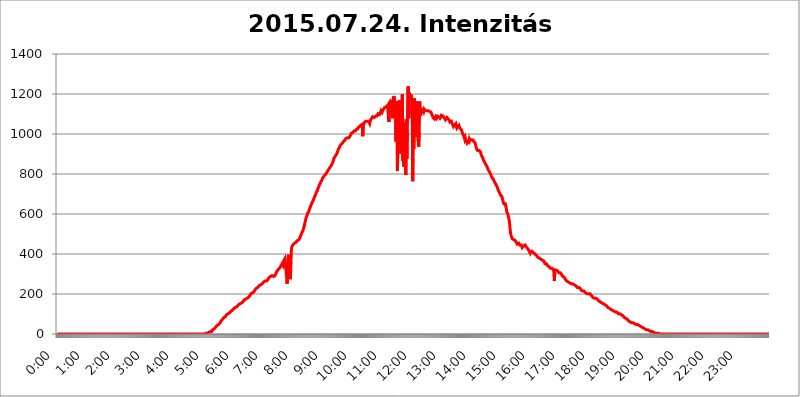
| Category | 2015.07.24. Intenzitás [W/m^2] |
|---|---|
| 0.0 | 0 |
| 0.0006944444444444445 | 0 |
| 0.001388888888888889 | 0 |
| 0.0020833333333333333 | 0 |
| 0.002777777777777778 | 0 |
| 0.003472222222222222 | 0 |
| 0.004166666666666667 | 0 |
| 0.004861111111111111 | 0 |
| 0.005555555555555556 | 0 |
| 0.0062499999999999995 | 0 |
| 0.006944444444444444 | 0 |
| 0.007638888888888889 | 0 |
| 0.008333333333333333 | 0 |
| 0.009027777777777779 | 0 |
| 0.009722222222222222 | 0 |
| 0.010416666666666666 | 0 |
| 0.011111111111111112 | 0 |
| 0.011805555555555555 | 0 |
| 0.012499999999999999 | 0 |
| 0.013194444444444444 | 0 |
| 0.013888888888888888 | 0 |
| 0.014583333333333332 | 0 |
| 0.015277777777777777 | 0 |
| 0.015972222222222224 | 0 |
| 0.016666666666666666 | 0 |
| 0.017361111111111112 | 0 |
| 0.018055555555555557 | 0 |
| 0.01875 | 0 |
| 0.019444444444444445 | 0 |
| 0.02013888888888889 | 0 |
| 0.020833333333333332 | 0 |
| 0.02152777777777778 | 0 |
| 0.022222222222222223 | 0 |
| 0.02291666666666667 | 0 |
| 0.02361111111111111 | 0 |
| 0.024305555555555556 | 0 |
| 0.024999999999999998 | 0 |
| 0.025694444444444447 | 0 |
| 0.02638888888888889 | 0 |
| 0.027083333333333334 | 0 |
| 0.027777777777777776 | 0 |
| 0.02847222222222222 | 0 |
| 0.029166666666666664 | 0 |
| 0.029861111111111113 | 0 |
| 0.030555555555555555 | 0 |
| 0.03125 | 0 |
| 0.03194444444444445 | 0 |
| 0.03263888888888889 | 0 |
| 0.03333333333333333 | 0 |
| 0.034027777777777775 | 0 |
| 0.034722222222222224 | 0 |
| 0.035416666666666666 | 0 |
| 0.036111111111111115 | 0 |
| 0.03680555555555556 | 0 |
| 0.0375 | 0 |
| 0.03819444444444444 | 0 |
| 0.03888888888888889 | 0 |
| 0.03958333333333333 | 0 |
| 0.04027777777777778 | 0 |
| 0.04097222222222222 | 0 |
| 0.041666666666666664 | 0 |
| 0.042361111111111106 | 0 |
| 0.04305555555555556 | 0 |
| 0.043750000000000004 | 0 |
| 0.044444444444444446 | 0 |
| 0.04513888888888889 | 0 |
| 0.04583333333333334 | 0 |
| 0.04652777777777778 | 0 |
| 0.04722222222222222 | 0 |
| 0.04791666666666666 | 0 |
| 0.04861111111111111 | 0 |
| 0.049305555555555554 | 0 |
| 0.049999999999999996 | 0 |
| 0.05069444444444445 | 0 |
| 0.051388888888888894 | 0 |
| 0.052083333333333336 | 0 |
| 0.05277777777777778 | 0 |
| 0.05347222222222222 | 0 |
| 0.05416666666666667 | 0 |
| 0.05486111111111111 | 0 |
| 0.05555555555555555 | 0 |
| 0.05625 | 0 |
| 0.05694444444444444 | 0 |
| 0.057638888888888885 | 0 |
| 0.05833333333333333 | 0 |
| 0.05902777777777778 | 0 |
| 0.059722222222222225 | 0 |
| 0.06041666666666667 | 0 |
| 0.061111111111111116 | 0 |
| 0.06180555555555556 | 0 |
| 0.0625 | 0 |
| 0.06319444444444444 | 0 |
| 0.06388888888888888 | 0 |
| 0.06458333333333334 | 0 |
| 0.06527777777777778 | 0 |
| 0.06597222222222222 | 0 |
| 0.06666666666666667 | 0 |
| 0.06736111111111111 | 0 |
| 0.06805555555555555 | 0 |
| 0.06874999999999999 | 0 |
| 0.06944444444444443 | 0 |
| 0.07013888888888889 | 0 |
| 0.07083333333333333 | 0 |
| 0.07152777777777779 | 0 |
| 0.07222222222222223 | 0 |
| 0.07291666666666667 | 0 |
| 0.07361111111111111 | 0 |
| 0.07430555555555556 | 0 |
| 0.075 | 0 |
| 0.07569444444444444 | 0 |
| 0.0763888888888889 | 0 |
| 0.07708333333333334 | 0 |
| 0.07777777777777778 | 0 |
| 0.07847222222222222 | 0 |
| 0.07916666666666666 | 0 |
| 0.0798611111111111 | 0 |
| 0.08055555555555556 | 0 |
| 0.08125 | 0 |
| 0.08194444444444444 | 0 |
| 0.08263888888888889 | 0 |
| 0.08333333333333333 | 0 |
| 0.08402777777777777 | 0 |
| 0.08472222222222221 | 0 |
| 0.08541666666666665 | 0 |
| 0.08611111111111112 | 0 |
| 0.08680555555555557 | 0 |
| 0.08750000000000001 | 0 |
| 0.08819444444444445 | 0 |
| 0.08888888888888889 | 0 |
| 0.08958333333333333 | 0 |
| 0.09027777777777778 | 0 |
| 0.09097222222222222 | 0 |
| 0.09166666666666667 | 0 |
| 0.09236111111111112 | 0 |
| 0.09305555555555556 | 0 |
| 0.09375 | 0 |
| 0.09444444444444444 | 0 |
| 0.09513888888888888 | 0 |
| 0.09583333333333333 | 0 |
| 0.09652777777777777 | 0 |
| 0.09722222222222222 | 0 |
| 0.09791666666666667 | 0 |
| 0.09861111111111111 | 0 |
| 0.09930555555555555 | 0 |
| 0.09999999999999999 | 0 |
| 0.10069444444444443 | 0 |
| 0.1013888888888889 | 0 |
| 0.10208333333333335 | 0 |
| 0.10277777777777779 | 0 |
| 0.10347222222222223 | 0 |
| 0.10416666666666667 | 0 |
| 0.10486111111111111 | 0 |
| 0.10555555555555556 | 0 |
| 0.10625 | 0 |
| 0.10694444444444444 | 0 |
| 0.1076388888888889 | 0 |
| 0.10833333333333334 | 0 |
| 0.10902777777777778 | 0 |
| 0.10972222222222222 | 0 |
| 0.1111111111111111 | 0 |
| 0.11180555555555556 | 0 |
| 0.11180555555555556 | 0 |
| 0.1125 | 0 |
| 0.11319444444444444 | 0 |
| 0.11388888888888889 | 0 |
| 0.11458333333333333 | 0 |
| 0.11527777777777777 | 0 |
| 0.11597222222222221 | 0 |
| 0.11666666666666665 | 0 |
| 0.1173611111111111 | 0 |
| 0.11805555555555557 | 0 |
| 0.11944444444444445 | 0 |
| 0.12013888888888889 | 0 |
| 0.12083333333333333 | 0 |
| 0.12152777777777778 | 0 |
| 0.12222222222222223 | 0 |
| 0.12291666666666667 | 0 |
| 0.12291666666666667 | 0 |
| 0.12361111111111112 | 0 |
| 0.12430555555555556 | 0 |
| 0.125 | 0 |
| 0.12569444444444444 | 0 |
| 0.12638888888888888 | 0 |
| 0.12708333333333333 | 0 |
| 0.16875 | 0 |
| 0.12847222222222224 | 0 |
| 0.12916666666666668 | 0 |
| 0.12986111111111112 | 0 |
| 0.13055555555555556 | 0 |
| 0.13125 | 0 |
| 0.13194444444444445 | 0 |
| 0.1326388888888889 | 0 |
| 0.13333333333333333 | 0 |
| 0.13402777777777777 | 0 |
| 0.13402777777777777 | 0 |
| 0.13472222222222222 | 0 |
| 0.13541666666666666 | 0 |
| 0.1361111111111111 | 0 |
| 0.13749999999999998 | 0 |
| 0.13819444444444443 | 0 |
| 0.1388888888888889 | 0 |
| 0.13958333333333334 | 0 |
| 0.14027777777777778 | 0 |
| 0.14097222222222222 | 0 |
| 0.14166666666666666 | 0 |
| 0.1423611111111111 | 0 |
| 0.14305555555555557 | 0 |
| 0.14375000000000002 | 0 |
| 0.14444444444444446 | 0 |
| 0.1451388888888889 | 0 |
| 0.1451388888888889 | 0 |
| 0.14652777777777778 | 0 |
| 0.14722222222222223 | 0 |
| 0.14791666666666667 | 0 |
| 0.1486111111111111 | 0 |
| 0.14930555555555555 | 0 |
| 0.15 | 0 |
| 0.15069444444444444 | 0 |
| 0.15138888888888888 | 0 |
| 0.15208333333333332 | 0 |
| 0.15277777777777776 | 0 |
| 0.15347222222222223 | 0 |
| 0.15416666666666667 | 0 |
| 0.15486111111111112 | 0 |
| 0.15555555555555556 | 0 |
| 0.15625 | 0 |
| 0.15694444444444444 | 0 |
| 0.15763888888888888 | 0 |
| 0.15833333333333333 | 0 |
| 0.15902777777777777 | 0 |
| 0.15972222222222224 | 0 |
| 0.16041666666666668 | 0 |
| 0.16111111111111112 | 0 |
| 0.16180555555555556 | 0 |
| 0.1625 | 0 |
| 0.16319444444444445 | 0 |
| 0.1638888888888889 | 0 |
| 0.16458333333333333 | 0 |
| 0.16527777777777777 | 0 |
| 0.16597222222222222 | 0 |
| 0.16666666666666666 | 0 |
| 0.1673611111111111 | 0 |
| 0.16805555555555554 | 0 |
| 0.16874999999999998 | 0 |
| 0.16944444444444443 | 0 |
| 0.17013888888888887 | 0 |
| 0.1708333333333333 | 0 |
| 0.17152777777777775 | 0 |
| 0.17222222222222225 | 0 |
| 0.1729166666666667 | 0 |
| 0.17361111111111113 | 0 |
| 0.17430555555555557 | 0 |
| 0.17500000000000002 | 0 |
| 0.17569444444444446 | 0 |
| 0.1763888888888889 | 0 |
| 0.17708333333333334 | 0 |
| 0.17777777777777778 | 0 |
| 0.17847222222222223 | 0 |
| 0.17916666666666667 | 0 |
| 0.1798611111111111 | 0 |
| 0.18055555555555555 | 0 |
| 0.18125 | 0 |
| 0.18194444444444444 | 0 |
| 0.1826388888888889 | 0 |
| 0.18333333333333335 | 0 |
| 0.1840277777777778 | 0 |
| 0.18472222222222223 | 0 |
| 0.18541666666666667 | 0 |
| 0.18611111111111112 | 0 |
| 0.18680555555555556 | 0 |
| 0.1875 | 0 |
| 0.18819444444444444 | 0 |
| 0.18888888888888888 | 0 |
| 0.18958333333333333 | 0 |
| 0.19027777777777777 | 0 |
| 0.1909722222222222 | 0 |
| 0.19166666666666665 | 0 |
| 0.19236111111111112 | 0 |
| 0.19305555555555554 | 0 |
| 0.19375 | 0 |
| 0.19444444444444445 | 0 |
| 0.1951388888888889 | 0 |
| 0.19583333333333333 | 0 |
| 0.19652777777777777 | 0 |
| 0.19722222222222222 | 0 |
| 0.19791666666666666 | 0 |
| 0.1986111111111111 | 0 |
| 0.19930555555555554 | 0 |
| 0.19999999999999998 | 0 |
| 0.20069444444444443 | 0 |
| 0.20138888888888887 | 0 |
| 0.2020833333333333 | 0 |
| 0.2027777777777778 | 0 |
| 0.2034722222222222 | 0 |
| 0.2041666666666667 | 0 |
| 0.20486111111111113 | 0 |
| 0.20555555555555557 | 0 |
| 0.20625000000000002 | 0 |
| 0.20694444444444446 | 3.525 |
| 0.2076388888888889 | 3.525 |
| 0.20833333333333334 | 3.525 |
| 0.20902777777777778 | 3.525 |
| 0.20972222222222223 | 3.525 |
| 0.21041666666666667 | 3.525 |
| 0.2111111111111111 | 3.525 |
| 0.21180555555555555 | 7.887 |
| 0.2125 | 7.887 |
| 0.21319444444444444 | 7.887 |
| 0.2138888888888889 | 7.887 |
| 0.21458333333333335 | 12.257 |
| 0.2152777777777778 | 12.257 |
| 0.21597222222222223 | 12.257 |
| 0.21666666666666667 | 12.257 |
| 0.21736111111111112 | 16.636 |
| 0.21805555555555556 | 21.024 |
| 0.21875 | 21.024 |
| 0.21944444444444444 | 21.024 |
| 0.22013888888888888 | 25.419 |
| 0.22083333333333333 | 29.823 |
| 0.22152777777777777 | 29.823 |
| 0.2222222222222222 | 34.234 |
| 0.22291666666666665 | 38.653 |
| 0.2236111111111111 | 38.653 |
| 0.22430555555555556 | 43.079 |
| 0.225 | 43.079 |
| 0.22569444444444445 | 47.511 |
| 0.2263888888888889 | 47.511 |
| 0.22708333333333333 | 51.951 |
| 0.22777777777777777 | 51.951 |
| 0.22847222222222222 | 56.398 |
| 0.22916666666666666 | 60.85 |
| 0.2298611111111111 | 65.31 |
| 0.23055555555555554 | 65.31 |
| 0.23124999999999998 | 69.775 |
| 0.23194444444444443 | 74.246 |
| 0.23263888888888887 | 74.246 |
| 0.2333333333333333 | 78.722 |
| 0.2340277777777778 | 83.205 |
| 0.2347222222222222 | 83.205 |
| 0.2354166666666667 | 87.692 |
| 0.23611111111111113 | 87.692 |
| 0.23680555555555557 | 92.184 |
| 0.23750000000000002 | 96.682 |
| 0.23819444444444446 | 96.682 |
| 0.2388888888888889 | 101.184 |
| 0.23958333333333334 | 101.184 |
| 0.24027777777777778 | 101.184 |
| 0.24097222222222223 | 105.69 |
| 0.24166666666666667 | 105.69 |
| 0.2423611111111111 | 110.201 |
| 0.24305555555555555 | 110.201 |
| 0.24375 | 114.716 |
| 0.24444444444444446 | 114.716 |
| 0.24513888888888888 | 119.235 |
| 0.24583333333333335 | 119.235 |
| 0.2465277777777778 | 123.758 |
| 0.24722222222222223 | 123.758 |
| 0.24791666666666667 | 128.284 |
| 0.24861111111111112 | 128.284 |
| 0.24930555555555556 | 128.284 |
| 0.25 | 132.814 |
| 0.25069444444444444 | 132.814 |
| 0.2513888888888889 | 137.347 |
| 0.2520833333333333 | 137.347 |
| 0.25277777777777777 | 137.347 |
| 0.2534722222222222 | 141.884 |
| 0.25416666666666665 | 146.423 |
| 0.2548611111111111 | 146.423 |
| 0.2555555555555556 | 146.423 |
| 0.25625000000000003 | 150.964 |
| 0.2569444444444445 | 150.964 |
| 0.2576388888888889 | 155.509 |
| 0.25833333333333336 | 155.509 |
| 0.2590277777777778 | 155.509 |
| 0.25972222222222224 | 160.056 |
| 0.2604166666666667 | 160.056 |
| 0.2611111111111111 | 164.605 |
| 0.26180555555555557 | 169.156 |
| 0.2625 | 169.156 |
| 0.26319444444444445 | 173.709 |
| 0.2638888888888889 | 173.709 |
| 0.26458333333333334 | 173.709 |
| 0.2652777777777778 | 173.709 |
| 0.2659722222222222 | 178.264 |
| 0.26666666666666666 | 178.264 |
| 0.2673611111111111 | 182.82 |
| 0.26805555555555555 | 182.82 |
| 0.26875 | 182.82 |
| 0.26944444444444443 | 187.378 |
| 0.2701388888888889 | 191.937 |
| 0.2708333333333333 | 191.937 |
| 0.27152777777777776 | 201.058 |
| 0.2722222222222222 | 201.058 |
| 0.27291666666666664 | 201.058 |
| 0.2736111111111111 | 205.62 |
| 0.2743055555555555 | 205.62 |
| 0.27499999999999997 | 210.182 |
| 0.27569444444444446 | 210.182 |
| 0.27638888888888885 | 214.746 |
| 0.27708333333333335 | 219.309 |
| 0.2777777777777778 | 219.309 |
| 0.27847222222222223 | 223.873 |
| 0.2791666666666667 | 228.436 |
| 0.2798611111111111 | 228.436 |
| 0.28055555555555556 | 233 |
| 0.28125 | 233 |
| 0.28194444444444444 | 237.564 |
| 0.2826388888888889 | 237.564 |
| 0.2833333333333333 | 242.127 |
| 0.28402777777777777 | 242.127 |
| 0.2847222222222222 | 246.689 |
| 0.28541666666666665 | 246.689 |
| 0.28611111111111115 | 251.251 |
| 0.28680555555555554 | 251.251 |
| 0.28750000000000003 | 251.251 |
| 0.2881944444444445 | 255.813 |
| 0.2888888888888889 | 255.813 |
| 0.28958333333333336 | 260.373 |
| 0.2902777777777778 | 260.373 |
| 0.29097222222222224 | 260.373 |
| 0.2916666666666667 | 264.932 |
| 0.2923611111111111 | 264.932 |
| 0.29305555555555557 | 264.932 |
| 0.29375 | 264.932 |
| 0.29444444444444445 | 269.49 |
| 0.2951388888888889 | 269.49 |
| 0.29583333333333334 | 274.047 |
| 0.2965277777777778 | 278.603 |
| 0.2972222222222222 | 283.156 |
| 0.29791666666666666 | 287.709 |
| 0.2986111111111111 | 287.709 |
| 0.29930555555555555 | 287.709 |
| 0.3 | 287.709 |
| 0.30069444444444443 | 292.259 |
| 0.3013888888888889 | 292.259 |
| 0.3020833333333333 | 292.259 |
| 0.30277777777777776 | 287.709 |
| 0.3034722222222222 | 287.709 |
| 0.30416666666666664 | 292.259 |
| 0.3048611111111111 | 292.259 |
| 0.3055555555555555 | 292.259 |
| 0.30624999999999997 | 296.808 |
| 0.3069444444444444 | 305.898 |
| 0.3076388888888889 | 305.898 |
| 0.30833333333333335 | 314.98 |
| 0.3090277777777778 | 319.517 |
| 0.30972222222222223 | 319.517 |
| 0.3104166666666667 | 324.052 |
| 0.3111111111111111 | 328.584 |
| 0.31180555555555556 | 328.584 |
| 0.3125 | 333.113 |
| 0.31319444444444444 | 333.113 |
| 0.3138888888888889 | 342.162 |
| 0.3145833333333333 | 346.682 |
| 0.31527777777777777 | 351.198 |
| 0.3159722222222222 | 346.682 |
| 0.31666666666666665 | 342.162 |
| 0.31736111111111115 | 337.639 |
| 0.31805555555555554 | 369.23 |
| 0.31875000000000003 | 373.729 |
| 0.3194444444444445 | 378.224 |
| 0.3201388888888889 | 378.224 |
| 0.32083333333333336 | 373.729 |
| 0.3215277777777778 | 292.259 |
| 0.32222222222222224 | 251.251 |
| 0.3229166666666667 | 269.49 |
| 0.3236111111111111 | 310.44 |
| 0.32430555555555557 | 396.164 |
| 0.325 | 369.23 |
| 0.32569444444444445 | 296.808 |
| 0.3263888888888889 | 274.047 |
| 0.32708333333333334 | 283.156 |
| 0.3277777777777778 | 355.712 |
| 0.3284722222222222 | 427.39 |
| 0.32916666666666666 | 436.27 |
| 0.3298611111111111 | 440.702 |
| 0.33055555555555555 | 445.129 |
| 0.33125 | 445.129 |
| 0.33194444444444443 | 449.551 |
| 0.3326388888888889 | 453.968 |
| 0.3333333333333333 | 458.38 |
| 0.3340277777777778 | 458.38 |
| 0.3347222222222222 | 458.38 |
| 0.3354166666666667 | 462.786 |
| 0.3361111111111111 | 462.786 |
| 0.3368055555555556 | 467.187 |
| 0.33749999999999997 | 471.582 |
| 0.33819444444444446 | 471.582 |
| 0.33888888888888885 | 471.582 |
| 0.33958333333333335 | 475.972 |
| 0.34027777777777773 | 480.356 |
| 0.34097222222222223 | 484.735 |
| 0.3416666666666666 | 493.475 |
| 0.3423611111111111 | 497.836 |
| 0.3430555555555555 | 506.542 |
| 0.34375 | 510.885 |
| 0.3444444444444445 | 515.223 |
| 0.3451388888888889 | 523.88 |
| 0.3458333333333334 | 528.2 |
| 0.34652777777777777 | 541.121 |
| 0.34722222222222227 | 553.986 |
| 0.34791666666666665 | 562.53 |
| 0.34861111111111115 | 575.299 |
| 0.34930555555555554 | 583.779 |
| 0.35000000000000003 | 588.009 |
| 0.3506944444444444 | 596.45 |
| 0.3513888888888889 | 604.864 |
| 0.3520833333333333 | 609.062 |
| 0.3527777777777778 | 613.252 |
| 0.3534722222222222 | 621.613 |
| 0.3541666666666667 | 625.784 |
| 0.3548611111111111 | 634.105 |
| 0.35555555555555557 | 638.256 |
| 0.35625 | 646.537 |
| 0.35694444444444445 | 650.667 |
| 0.3576388888888889 | 658.909 |
| 0.35833333333333334 | 663.019 |
| 0.3590277777777778 | 667.123 |
| 0.3597222222222222 | 675.311 |
| 0.36041666666666666 | 679.395 |
| 0.3611111111111111 | 687.544 |
| 0.36180555555555555 | 691.608 |
| 0.3625 | 699.717 |
| 0.36319444444444443 | 707.8 |
| 0.3638888888888889 | 711.832 |
| 0.3645833333333333 | 715.858 |
| 0.3652777777777778 | 723.889 |
| 0.3659722222222222 | 727.896 |
| 0.3666666666666667 | 735.89 |
| 0.3673611111111111 | 743.859 |
| 0.3680555555555556 | 747.834 |
| 0.36874999999999997 | 751.803 |
| 0.36944444444444446 | 759.723 |
| 0.37013888888888885 | 763.674 |
| 0.37083333333333335 | 767.62 |
| 0.37152777777777773 | 771.559 |
| 0.37222222222222223 | 779.42 |
| 0.3729166666666666 | 779.42 |
| 0.3736111111111111 | 787.258 |
| 0.3743055555555555 | 787.258 |
| 0.375 | 791.169 |
| 0.3756944444444445 | 795.074 |
| 0.3763888888888889 | 798.974 |
| 0.3770833333333334 | 802.868 |
| 0.37777777777777777 | 802.868 |
| 0.37847222222222227 | 810.641 |
| 0.37916666666666665 | 810.641 |
| 0.37986111111111115 | 814.519 |
| 0.38055555555555554 | 822.26 |
| 0.38125000000000003 | 826.123 |
| 0.3819444444444444 | 829.981 |
| 0.3826388888888889 | 833.834 |
| 0.3833333333333333 | 837.682 |
| 0.3840277777777778 | 841.526 |
| 0.3847222222222222 | 845.365 |
| 0.3854166666666667 | 849.199 |
| 0.3861111111111111 | 849.199 |
| 0.38680555555555557 | 860.676 |
| 0.3875 | 864.493 |
| 0.38819444444444445 | 879.719 |
| 0.3888888888888889 | 879.719 |
| 0.38958333333333334 | 887.309 |
| 0.3902777777777778 | 891.099 |
| 0.3909722222222222 | 894.885 |
| 0.39166666666666666 | 894.885 |
| 0.3923611111111111 | 902.447 |
| 0.39305555555555555 | 909.996 |
| 0.39375 | 917.534 |
| 0.39444444444444443 | 925.06 |
| 0.3951388888888889 | 928.819 |
| 0.3958333333333333 | 932.576 |
| 0.3965277777777778 | 940.082 |
| 0.3972222222222222 | 943.832 |
| 0.3979166666666667 | 947.58 |
| 0.3986111111111111 | 947.58 |
| 0.3993055555555556 | 951.327 |
| 0.39999999999999997 | 955.071 |
| 0.40069444444444446 | 955.071 |
| 0.40138888888888885 | 962.555 |
| 0.40208333333333335 | 962.555 |
| 0.40277777777777773 | 966.295 |
| 0.40347222222222223 | 970.034 |
| 0.4041666666666666 | 973.772 |
| 0.4048611111111111 | 977.508 |
| 0.4055555555555555 | 977.508 |
| 0.40625 | 981.244 |
| 0.4069444444444445 | 981.244 |
| 0.4076388888888889 | 981.244 |
| 0.4083333333333334 | 981.244 |
| 0.40902777777777777 | 981.244 |
| 0.40972222222222227 | 984.98 |
| 0.41041666666666665 | 984.98 |
| 0.41111111111111115 | 992.448 |
| 0.41180555555555554 | 996.182 |
| 0.41250000000000003 | 1003.65 |
| 0.4131944444444444 | 1007.383 |
| 0.4138888888888889 | 1007.383 |
| 0.4145833333333333 | 1007.383 |
| 0.4152777777777778 | 1011.118 |
| 0.4159722222222222 | 1014.852 |
| 0.4166666666666667 | 1014.852 |
| 0.4173611111111111 | 1014.852 |
| 0.41805555555555557 | 1014.852 |
| 0.41875 | 1018.587 |
| 0.41944444444444445 | 1022.323 |
| 0.4201388888888889 | 1026.06 |
| 0.42083333333333334 | 1022.323 |
| 0.4215277777777778 | 1026.06 |
| 0.4222222222222222 | 1033.537 |
| 0.42291666666666666 | 1029.798 |
| 0.4236111111111111 | 1033.537 |
| 0.42430555555555555 | 1037.277 |
| 0.425 | 1041.019 |
| 0.42569444444444443 | 1044.762 |
| 0.4263888888888889 | 1044.762 |
| 0.4270833333333333 | 1044.762 |
| 0.4277777777777778 | 1048.508 |
| 0.4284722222222222 | 988.714 |
| 0.4291666666666667 | 1037.277 |
| 0.4298611111111111 | 1048.508 |
| 0.4305555555555556 | 1056.004 |
| 0.43124999999999997 | 1059.756 |
| 0.43194444444444446 | 1059.756 |
| 0.43263888888888885 | 1063.51 |
| 0.43333333333333335 | 1059.756 |
| 0.43402777777777773 | 1063.51 |
| 0.43472222222222223 | 1063.51 |
| 0.4354166666666666 | 1063.51 |
| 0.4361111111111111 | 1067.267 |
| 0.4368055555555555 | 1063.51 |
| 0.4375 | 1063.51 |
| 0.4381944444444445 | 1052.255 |
| 0.4388888888888889 | 1063.51 |
| 0.4395833333333334 | 1071.027 |
| 0.44027777777777777 | 1071.027 |
| 0.44097222222222227 | 1078.555 |
| 0.44166666666666665 | 1082.324 |
| 0.44236111111111115 | 1086.097 |
| 0.44305555555555554 | 1086.097 |
| 0.44375000000000003 | 1082.324 |
| 0.4444444444444444 | 1082.324 |
| 0.4451388888888889 | 1086.097 |
| 0.4458333333333333 | 1086.097 |
| 0.4465277777777778 | 1089.873 |
| 0.4472222222222222 | 1089.873 |
| 0.4479166666666667 | 1089.873 |
| 0.4486111111111111 | 1089.873 |
| 0.44930555555555557 | 1093.653 |
| 0.45 | 1101.226 |
| 0.45069444444444445 | 1101.226 |
| 0.4513888888888889 | 1101.226 |
| 0.45208333333333334 | 1097.437 |
| 0.4527777777777778 | 1101.226 |
| 0.4534722222222222 | 1108.816 |
| 0.45416666666666666 | 1116.426 |
| 0.4548611111111111 | 1116.426 |
| 0.45555555555555555 | 1108.816 |
| 0.45625 | 1116.426 |
| 0.45694444444444443 | 1120.238 |
| 0.4576388888888889 | 1124.056 |
| 0.4583333333333333 | 1127.879 |
| 0.4590277777777778 | 1131.708 |
| 0.4597222222222222 | 1127.879 |
| 0.4604166666666667 | 1131.708 |
| 0.4611111111111111 | 1135.543 |
| 0.4618055555555556 | 1135.543 |
| 0.46249999999999997 | 1139.384 |
| 0.46319444444444446 | 1143.232 |
| 0.46388888888888885 | 1143.232 |
| 0.46458333333333335 | 1147.086 |
| 0.46527777777777773 | 1059.756 |
| 0.46597222222222223 | 1162.571 |
| 0.4666666666666666 | 1154.814 |
| 0.4673611111111111 | 1162.571 |
| 0.4680555555555555 | 1162.571 |
| 0.46875 | 1158.689 |
| 0.4694444444444445 | 1150.946 |
| 0.4701388888888889 | 1078.555 |
| 0.4708333333333334 | 1170.358 |
| 0.47152777777777777 | 1178.177 |
| 0.47222222222222227 | 1189.969 |
| 0.47291666666666665 | 1193.918 |
| 0.47361111111111115 | 1193.918 |
| 0.47430555555555554 | 1108.816 |
| 0.47500000000000003 | 962.555 |
| 0.4756944444444444 | 1162.571 |
| 0.4763888888888889 | 1078.555 |
| 0.4770833333333333 | 814.519 |
| 0.4777777777777778 | 981.244 |
| 0.4784722222222222 | 966.295 |
| 0.4791666666666667 | 992.448 |
| 0.4798611111111111 | 1170.358 |
| 0.48055555555555557 | 940.082 |
| 0.48125 | 1041.019 |
| 0.48194444444444445 | 902.447 |
| 0.4826388888888889 | 1022.323 |
| 0.48333333333333334 | 977.508 |
| 0.4840277777777778 | 1197.876 |
| 0.4847222222222222 | 864.493 |
| 0.48541666666666666 | 962.555 |
| 0.4861111111111111 | 837.682 |
| 0.48680555555555555 | 1059.756 |
| 0.4875 | 947.58 |
| 0.48819444444444443 | 887.309 |
| 0.4888888888888889 | 795.074 |
| 0.4895833333333333 | 1074.789 |
| 0.4902777777777778 | 875.918 |
| 0.4909722222222222 | 1014.852 |
| 0.4916666666666667 | 1229.899 |
| 0.4923611111111111 | 1238.014 |
| 0.4930555555555556 | 1078.555 |
| 0.49374999999999997 | 1205.82 |
| 0.49444444444444446 | 1209.807 |
| 0.49513888888888885 | 1186.03 |
| 0.49583333333333335 | 1197.876 |
| 0.49652777777777773 | 1189.969 |
| 0.49722222222222223 | 1178.177 |
| 0.4979166666666666 | 1078.555 |
| 0.4986111111111111 | 763.674 |
| 0.4993055555555555 | 1174.263 |
| 0.5 | 925.06 |
| 0.5006944444444444 | 1178.177 |
| 0.5013888888888889 | 1174.263 |
| 0.5020833333333333 | 1093.653 |
| 0.5027777777777778 | 984.98 |
| 0.5034722222222222 | 1086.097 |
| 0.5041666666666667 | 1154.814 |
| 0.5048611111111111 | 1162.571 |
| 0.5055555555555555 | 1158.689 |
| 0.50625 | 966.295 |
| 0.5069444444444444 | 936.33 |
| 0.5076388888888889 | 1011.118 |
| 0.5083333333333333 | 1162.571 |
| 0.5090277777777777 | 1101.226 |
| 0.5097222222222222 | 1089.873 |
| 0.5104166666666666 | 1124.056 |
| 0.5111111111111112 | 1124.056 |
| 0.5118055555555555 | 1127.879 |
| 0.5125000000000001 | 1124.056 |
| 0.5131944444444444 | 1120.238 |
| 0.513888888888889 | 1112.618 |
| 0.5145833333333333 | 1124.056 |
| 0.5152777777777778 | 1124.056 |
| 0.5159722222222222 | 1116.426 |
| 0.5166666666666667 | 1116.426 |
| 0.517361111111111 | 1116.426 |
| 0.5180555555555556 | 1116.426 |
| 0.5187499999999999 | 1116.426 |
| 0.5194444444444445 | 1116.426 |
| 0.5201388888888888 | 1116.426 |
| 0.5208333333333334 | 1112.618 |
| 0.5215277777777778 | 1112.618 |
| 0.5222222222222223 | 1112.618 |
| 0.5229166666666667 | 1112.618 |
| 0.5236111111111111 | 1108.816 |
| 0.5243055555555556 | 1108.816 |
| 0.525 | 1101.226 |
| 0.5256944444444445 | 1097.437 |
| 0.5263888888888889 | 1097.437 |
| 0.5270833333333333 | 1082.324 |
| 0.5277777777777778 | 1078.555 |
| 0.5284722222222222 | 1086.097 |
| 0.5291666666666667 | 1074.789 |
| 0.5298611111111111 | 1078.555 |
| 0.5305555555555556 | 1086.097 |
| 0.53125 | 1082.324 |
| 0.5319444444444444 | 1078.555 |
| 0.5326388888888889 | 1082.324 |
| 0.5333333333333333 | 1089.873 |
| 0.5340277777777778 | 1089.873 |
| 0.5347222222222222 | 1089.873 |
| 0.5354166666666667 | 1086.097 |
| 0.5361111111111111 | 1082.324 |
| 0.5368055555555555 | 1078.555 |
| 0.5375 | 1082.324 |
| 0.5381944444444444 | 1086.097 |
| 0.5388888888888889 | 1093.653 |
| 0.5395833333333333 | 1093.653 |
| 0.5402777777777777 | 1093.653 |
| 0.5409722222222222 | 1089.873 |
| 0.5416666666666666 | 1089.873 |
| 0.5423611111111112 | 1086.097 |
| 0.5430555555555555 | 1078.555 |
| 0.5437500000000001 | 1082.324 |
| 0.5444444444444444 | 1071.027 |
| 0.545138888888889 | 1067.267 |
| 0.5458333333333333 | 1071.027 |
| 0.5465277777777778 | 1082.324 |
| 0.5472222222222222 | 1082.324 |
| 0.5479166666666667 | 1078.555 |
| 0.548611111111111 | 1074.789 |
| 0.5493055555555556 | 1071.027 |
| 0.5499999999999999 | 1067.267 |
| 0.5506944444444445 | 1059.756 |
| 0.5513888888888888 | 1063.51 |
| 0.5520833333333334 | 1059.756 |
| 0.5527777777777778 | 1063.51 |
| 0.5534722222222223 | 1056.004 |
| 0.5541666666666667 | 1059.756 |
| 0.5548611111111111 | 1052.255 |
| 0.5555555555555556 | 1037.277 |
| 0.55625 | 1037.277 |
| 0.5569444444444445 | 1044.762 |
| 0.5576388888888889 | 1048.508 |
| 0.5583333333333333 | 1041.019 |
| 0.5590277777777778 | 1052.255 |
| 0.5597222222222222 | 1037.277 |
| 0.5604166666666667 | 1029.798 |
| 0.5611111111111111 | 1033.537 |
| 0.5618055555555556 | 1037.277 |
| 0.5625 | 1048.508 |
| 0.5631944444444444 | 1029.798 |
| 0.5638888888888889 | 1037.277 |
| 0.5645833333333333 | 1029.798 |
| 0.5652777777777778 | 1029.798 |
| 0.5659722222222222 | 1026.06 |
| 0.5666666666666667 | 1022.323 |
| 0.5673611111111111 | 1018.587 |
| 0.5680555555555555 | 1007.383 |
| 0.56875 | 999.916 |
| 0.5694444444444444 | 999.916 |
| 0.5701388888888889 | 996.182 |
| 0.5708333333333333 | 984.98 |
| 0.5715277777777777 | 973.772 |
| 0.5722222222222222 | 981.244 |
| 0.5729166666666666 | 970.034 |
| 0.5736111111111112 | 958.814 |
| 0.5743055555555555 | 970.034 |
| 0.5750000000000001 | 955.071 |
| 0.5756944444444444 | 951.327 |
| 0.576388888888889 | 955.071 |
| 0.5770833333333333 | 962.555 |
| 0.5777777777777778 | 973.772 |
| 0.5784722222222222 | 966.295 |
| 0.5791666666666667 | 973.772 |
| 0.579861111111111 | 977.508 |
| 0.5805555555555556 | 970.034 |
| 0.5812499999999999 | 970.034 |
| 0.5819444444444445 | 973.772 |
| 0.5826388888888888 | 973.772 |
| 0.5833333333333334 | 970.034 |
| 0.5840277777777778 | 962.555 |
| 0.5847222222222223 | 958.814 |
| 0.5854166666666667 | 958.814 |
| 0.5861111111111111 | 955.071 |
| 0.5868055555555556 | 951.327 |
| 0.5875 | 936.33 |
| 0.5881944444444445 | 925.06 |
| 0.5888888888888889 | 925.06 |
| 0.5895833333333333 | 917.534 |
| 0.5902777777777778 | 921.298 |
| 0.5909722222222222 | 917.534 |
| 0.5916666666666667 | 917.534 |
| 0.5923611111111111 | 917.534 |
| 0.5930555555555556 | 917.534 |
| 0.59375 | 909.996 |
| 0.5944444444444444 | 898.668 |
| 0.5951388888888889 | 891.099 |
| 0.5958333333333333 | 887.309 |
| 0.5965277777777778 | 883.516 |
| 0.5972222222222222 | 875.918 |
| 0.5979166666666667 | 868.305 |
| 0.5986111111111111 | 864.493 |
| 0.5993055555555555 | 860.676 |
| 0.6 | 853.029 |
| 0.6006944444444444 | 849.199 |
| 0.6013888888888889 | 849.199 |
| 0.6020833333333333 | 841.526 |
| 0.6027777777777777 | 837.682 |
| 0.6034722222222222 | 829.981 |
| 0.6041666666666666 | 822.26 |
| 0.6048611111111112 | 818.392 |
| 0.6055555555555555 | 818.392 |
| 0.6062500000000001 | 810.641 |
| 0.6069444444444444 | 810.641 |
| 0.607638888888889 | 810.641 |
| 0.6083333333333333 | 795.074 |
| 0.6090277777777778 | 787.258 |
| 0.6097222222222222 | 783.342 |
| 0.6104166666666667 | 783.342 |
| 0.611111111111111 | 775.492 |
| 0.6118055555555556 | 771.559 |
| 0.6124999999999999 | 767.62 |
| 0.6131944444444445 | 763.674 |
| 0.6138888888888888 | 755.766 |
| 0.6145833333333334 | 751.803 |
| 0.6152777777777778 | 747.834 |
| 0.6159722222222223 | 747.834 |
| 0.6166666666666667 | 743.859 |
| 0.6173611111111111 | 731.896 |
| 0.6180555555555556 | 723.889 |
| 0.61875 | 719.877 |
| 0.6194444444444445 | 711.832 |
| 0.6201388888888889 | 715.858 |
| 0.6208333333333333 | 703.762 |
| 0.6215277777777778 | 695.666 |
| 0.6222222222222222 | 691.608 |
| 0.6229166666666667 | 695.666 |
| 0.6236111111111111 | 687.544 |
| 0.6243055555555556 | 683.473 |
| 0.625 | 667.123 |
| 0.6256944444444444 | 663.019 |
| 0.6263888888888889 | 650.667 |
| 0.6270833333333333 | 654.791 |
| 0.6277777777777778 | 654.791 |
| 0.6284722222222222 | 650.667 |
| 0.6291666666666667 | 638.256 |
| 0.6298611111111111 | 625.784 |
| 0.6305555555555555 | 609.062 |
| 0.63125 | 604.864 |
| 0.6319444444444444 | 600.661 |
| 0.6326388888888889 | 588.009 |
| 0.6333333333333333 | 583.779 |
| 0.6340277777777777 | 566.793 |
| 0.6347222222222222 | 541.121 |
| 0.6354166666666666 | 515.223 |
| 0.6361111111111112 | 497.836 |
| 0.6368055555555555 | 489.108 |
| 0.6375000000000001 | 484.735 |
| 0.6381944444444444 | 475.972 |
| 0.638888888888889 | 471.582 |
| 0.6395833333333333 | 471.582 |
| 0.6402777777777778 | 471.582 |
| 0.6409722222222222 | 471.582 |
| 0.6416666666666667 | 471.582 |
| 0.642361111111111 | 467.187 |
| 0.6430555555555556 | 462.786 |
| 0.6437499999999999 | 458.38 |
| 0.6444444444444445 | 453.968 |
| 0.6451388888888888 | 449.551 |
| 0.6458333333333334 | 449.551 |
| 0.6465277777777778 | 453.968 |
| 0.6472222222222223 | 453.968 |
| 0.6479166666666667 | 453.968 |
| 0.6486111111111111 | 445.129 |
| 0.6493055555555556 | 449.551 |
| 0.65 | 445.129 |
| 0.6506944444444445 | 445.129 |
| 0.6513888888888889 | 440.702 |
| 0.6520833333333333 | 431.833 |
| 0.6527777777777778 | 427.39 |
| 0.6534722222222222 | 436.27 |
| 0.6541666666666667 | 440.702 |
| 0.6548611111111111 | 440.702 |
| 0.6555555555555556 | 440.702 |
| 0.65625 | 445.129 |
| 0.6569444444444444 | 440.702 |
| 0.6576388888888889 | 436.27 |
| 0.6583333333333333 | 431.833 |
| 0.6590277777777778 | 431.833 |
| 0.6597222222222222 | 427.39 |
| 0.6604166666666667 | 427.39 |
| 0.6611111111111111 | 418.492 |
| 0.6618055555555555 | 418.492 |
| 0.6625 | 422.943 |
| 0.6631944444444444 | 405.108 |
| 0.6638888888888889 | 414.035 |
| 0.6645833333333333 | 414.035 |
| 0.6652777777777777 | 414.035 |
| 0.6659722222222222 | 414.035 |
| 0.6666666666666666 | 414.035 |
| 0.6673611111111111 | 414.035 |
| 0.6680555555555556 | 405.108 |
| 0.6687500000000001 | 405.108 |
| 0.6694444444444444 | 400.638 |
| 0.6701388888888888 | 400.638 |
| 0.6708333333333334 | 396.164 |
| 0.6715277777777778 | 396.164 |
| 0.6722222222222222 | 391.685 |
| 0.6729166666666666 | 387.202 |
| 0.6736111111111112 | 387.202 |
| 0.6743055555555556 | 382.715 |
| 0.6749999999999999 | 382.715 |
| 0.6756944444444444 | 378.224 |
| 0.6763888888888889 | 378.224 |
| 0.6770833333333334 | 378.224 |
| 0.6777777777777777 | 378.224 |
| 0.6784722222222223 | 373.729 |
| 0.6791666666666667 | 373.729 |
| 0.6798611111111111 | 369.23 |
| 0.6805555555555555 | 369.23 |
| 0.68125 | 369.23 |
| 0.6819444444444445 | 364.728 |
| 0.6826388888888889 | 364.728 |
| 0.6833333333333332 | 360.221 |
| 0.6840277777777778 | 351.198 |
| 0.6847222222222222 | 351.198 |
| 0.6854166666666667 | 351.198 |
| 0.686111111111111 | 351.198 |
| 0.6868055555555556 | 346.682 |
| 0.6875 | 342.162 |
| 0.6881944444444444 | 337.639 |
| 0.688888888888889 | 337.639 |
| 0.6895833333333333 | 337.639 |
| 0.6902777777777778 | 333.113 |
| 0.6909722222222222 | 333.113 |
| 0.6916666666666668 | 328.584 |
| 0.6923611111111111 | 328.584 |
| 0.6930555555555555 | 328.584 |
| 0.69375 | 328.584 |
| 0.6944444444444445 | 328.584 |
| 0.6951388888888889 | 328.584 |
| 0.6958333333333333 | 324.052 |
| 0.6965277777777777 | 310.44 |
| 0.6972222222222223 | 264.932 |
| 0.6979166666666666 | 319.517 |
| 0.6986111111111111 | 319.517 |
| 0.6993055555555556 | 314.98 |
| 0.7000000000000001 | 319.517 |
| 0.7006944444444444 | 314.98 |
| 0.7013888888888888 | 314.98 |
| 0.7020833333333334 | 314.98 |
| 0.7027777777777778 | 310.44 |
| 0.7034722222222222 | 305.898 |
| 0.7041666666666666 | 305.898 |
| 0.7048611111111112 | 305.898 |
| 0.7055555555555556 | 305.898 |
| 0.7062499999999999 | 305.898 |
| 0.7069444444444444 | 301.354 |
| 0.7076388888888889 | 296.808 |
| 0.7083333333333334 | 296.808 |
| 0.7090277777777777 | 287.709 |
| 0.7097222222222223 | 287.709 |
| 0.7104166666666667 | 287.709 |
| 0.7111111111111111 | 283.156 |
| 0.7118055555555555 | 278.603 |
| 0.7125 | 274.047 |
| 0.7131944444444445 | 274.047 |
| 0.7138888888888889 | 269.49 |
| 0.7145833333333332 | 264.932 |
| 0.7152777777777778 | 260.373 |
| 0.7159722222222222 | 260.373 |
| 0.7166666666666667 | 260.373 |
| 0.717361111111111 | 260.373 |
| 0.7180555555555556 | 260.373 |
| 0.71875 | 255.813 |
| 0.7194444444444444 | 255.813 |
| 0.720138888888889 | 255.813 |
| 0.7208333333333333 | 251.251 |
| 0.7215277777777778 | 251.251 |
| 0.7222222222222222 | 251.251 |
| 0.7229166666666668 | 251.251 |
| 0.7236111111111111 | 251.251 |
| 0.7243055555555555 | 246.689 |
| 0.725 | 246.689 |
| 0.7256944444444445 | 246.689 |
| 0.7263888888888889 | 242.127 |
| 0.7270833333333333 | 242.127 |
| 0.7277777777777777 | 242.127 |
| 0.7284722222222223 | 237.564 |
| 0.7291666666666666 | 233 |
| 0.7298611111111111 | 233 |
| 0.7305555555555556 | 233 |
| 0.7312500000000001 | 233 |
| 0.7319444444444444 | 228.436 |
| 0.7326388888888888 | 228.436 |
| 0.7333333333333334 | 228.436 |
| 0.7340277777777778 | 223.873 |
| 0.7347222222222222 | 219.309 |
| 0.7354166666666666 | 219.309 |
| 0.7361111111111112 | 219.309 |
| 0.7368055555555556 | 214.746 |
| 0.7374999999999999 | 214.746 |
| 0.7381944444444444 | 214.746 |
| 0.7388888888888889 | 214.746 |
| 0.7395833333333334 | 210.182 |
| 0.7402777777777777 | 210.182 |
| 0.7409722222222223 | 205.62 |
| 0.7416666666666667 | 205.62 |
| 0.7423611111111111 | 205.62 |
| 0.7430555555555555 | 201.058 |
| 0.74375 | 201.058 |
| 0.7444444444444445 | 201.058 |
| 0.7451388888888889 | 201.058 |
| 0.7458333333333332 | 201.058 |
| 0.7465277777777778 | 201.058 |
| 0.7472222222222222 | 201.058 |
| 0.7479166666666667 | 196.497 |
| 0.748611111111111 | 196.497 |
| 0.7493055555555556 | 191.937 |
| 0.75 | 191.937 |
| 0.7506944444444444 | 187.378 |
| 0.751388888888889 | 182.82 |
| 0.7520833333333333 | 182.82 |
| 0.7527777777777778 | 182.82 |
| 0.7534722222222222 | 178.264 |
| 0.7541666666666668 | 178.264 |
| 0.7548611111111111 | 178.264 |
| 0.7555555555555555 | 178.264 |
| 0.75625 | 173.709 |
| 0.7569444444444445 | 173.709 |
| 0.7576388888888889 | 173.709 |
| 0.7583333333333333 | 169.156 |
| 0.7590277777777777 | 169.156 |
| 0.7597222222222223 | 164.605 |
| 0.7604166666666666 | 164.605 |
| 0.7611111111111111 | 164.605 |
| 0.7618055555555556 | 160.056 |
| 0.7625000000000001 | 160.056 |
| 0.7631944444444444 | 155.509 |
| 0.7638888888888888 | 155.509 |
| 0.7645833333333334 | 155.509 |
| 0.7652777777777778 | 155.509 |
| 0.7659722222222222 | 150.964 |
| 0.7666666666666666 | 150.964 |
| 0.7673611111111112 | 146.423 |
| 0.7680555555555556 | 146.423 |
| 0.7687499999999999 | 146.423 |
| 0.7694444444444444 | 141.884 |
| 0.7701388888888889 | 141.884 |
| 0.7708333333333334 | 137.347 |
| 0.7715277777777777 | 137.347 |
| 0.7722222222222223 | 132.814 |
| 0.7729166666666667 | 132.814 |
| 0.7736111111111111 | 128.284 |
| 0.7743055555555555 | 128.284 |
| 0.775 | 128.284 |
| 0.7756944444444445 | 128.284 |
| 0.7763888888888889 | 123.758 |
| 0.7770833333333332 | 123.758 |
| 0.7777777777777778 | 123.758 |
| 0.7784722222222222 | 119.235 |
| 0.7791666666666667 | 119.235 |
| 0.779861111111111 | 119.235 |
| 0.7805555555555556 | 114.716 |
| 0.78125 | 114.716 |
| 0.7819444444444444 | 114.716 |
| 0.782638888888889 | 110.201 |
| 0.7833333333333333 | 110.201 |
| 0.7840277777777778 | 110.201 |
| 0.7847222222222222 | 110.201 |
| 0.7854166666666668 | 105.69 |
| 0.7861111111111111 | 105.69 |
| 0.7868055555555555 | 101.184 |
| 0.7875 | 101.184 |
| 0.7881944444444445 | 101.184 |
| 0.7888888888888889 | 101.184 |
| 0.7895833333333333 | 101.184 |
| 0.7902777777777777 | 96.682 |
| 0.7909722222222223 | 96.682 |
| 0.7916666666666666 | 92.184 |
| 0.7923611111111111 | 92.184 |
| 0.7930555555555556 | 92.184 |
| 0.7937500000000001 | 87.692 |
| 0.7944444444444444 | 87.692 |
| 0.7951388888888888 | 83.205 |
| 0.7958333333333334 | 83.205 |
| 0.7965277777777778 | 78.722 |
| 0.7972222222222222 | 78.722 |
| 0.7979166666666666 | 74.246 |
| 0.7986111111111112 | 74.246 |
| 0.7993055555555556 | 74.246 |
| 0.7999999999999999 | 69.775 |
| 0.8006944444444444 | 69.775 |
| 0.8013888888888889 | 65.31 |
| 0.8020833333333334 | 65.31 |
| 0.8027777777777777 | 65.31 |
| 0.8034722222222223 | 60.85 |
| 0.8041666666666667 | 60.85 |
| 0.8048611111111111 | 60.85 |
| 0.8055555555555555 | 56.398 |
| 0.80625 | 56.398 |
| 0.8069444444444445 | 56.398 |
| 0.8076388888888889 | 56.398 |
| 0.8083333333333332 | 51.951 |
| 0.8090277777777778 | 51.951 |
| 0.8097222222222222 | 51.951 |
| 0.8104166666666667 | 51.951 |
| 0.811111111111111 | 51.951 |
| 0.8118055555555556 | 47.511 |
| 0.8125 | 47.511 |
| 0.8131944444444444 | 47.511 |
| 0.813888888888889 | 47.511 |
| 0.8145833333333333 | 47.511 |
| 0.8152777777777778 | 47.511 |
| 0.8159722222222222 | 43.079 |
| 0.8166666666666668 | 43.079 |
| 0.8173611111111111 | 43.079 |
| 0.8180555555555555 | 38.653 |
| 0.81875 | 38.653 |
| 0.8194444444444445 | 38.653 |
| 0.8201388888888889 | 34.234 |
| 0.8208333333333333 | 34.234 |
| 0.8215277777777777 | 29.823 |
| 0.8222222222222223 | 29.823 |
| 0.8229166666666666 | 29.823 |
| 0.8236111111111111 | 29.823 |
| 0.8243055555555556 | 25.419 |
| 0.8250000000000001 | 25.419 |
| 0.8256944444444444 | 21.024 |
| 0.8263888888888888 | 21.024 |
| 0.8270833333333334 | 21.024 |
| 0.8277777777777778 | 21.024 |
| 0.8284722222222222 | 21.024 |
| 0.8291666666666666 | 21.024 |
| 0.8298611111111112 | 16.636 |
| 0.8305555555555556 | 16.636 |
| 0.8312499999999999 | 16.636 |
| 0.8319444444444444 | 16.636 |
| 0.8326388888888889 | 12.257 |
| 0.8333333333333334 | 12.257 |
| 0.8340277777777777 | 12.257 |
| 0.8347222222222223 | 12.257 |
| 0.8354166666666667 | 7.887 |
| 0.8361111111111111 | 7.887 |
| 0.8368055555555555 | 7.887 |
| 0.8375 | 7.887 |
| 0.8381944444444445 | 3.525 |
| 0.8388888888888889 | 3.525 |
| 0.8395833333333332 | 3.525 |
| 0.8402777777777778 | 3.525 |
| 0.8409722222222222 | 3.525 |
| 0.8416666666666667 | 3.525 |
| 0.842361111111111 | 3.525 |
| 0.8430555555555556 | 3.525 |
| 0.84375 | 3.525 |
| 0.8444444444444444 | 0 |
| 0.845138888888889 | 0 |
| 0.8458333333333333 | 0 |
| 0.8465277777777778 | 0 |
| 0.8472222222222222 | 0 |
| 0.8479166666666668 | 0 |
| 0.8486111111111111 | 0 |
| 0.8493055555555555 | 0 |
| 0.85 | 0 |
| 0.8506944444444445 | 0 |
| 0.8513888888888889 | 0 |
| 0.8520833333333333 | 0 |
| 0.8527777777777777 | 0 |
| 0.8534722222222223 | 0 |
| 0.8541666666666666 | 0 |
| 0.8548611111111111 | 0 |
| 0.8555555555555556 | 0 |
| 0.8562500000000001 | 0 |
| 0.8569444444444444 | 0 |
| 0.8576388888888888 | 0 |
| 0.8583333333333334 | 0 |
| 0.8590277777777778 | 0 |
| 0.8597222222222222 | 0 |
| 0.8604166666666666 | 0 |
| 0.8611111111111112 | 0 |
| 0.8618055555555556 | 0 |
| 0.8624999999999999 | 0 |
| 0.8631944444444444 | 0 |
| 0.8638888888888889 | 0 |
| 0.8645833333333334 | 0 |
| 0.8652777777777777 | 0 |
| 0.8659722222222223 | 0 |
| 0.8666666666666667 | 0 |
| 0.8673611111111111 | 0 |
| 0.8680555555555555 | 0 |
| 0.86875 | 0 |
| 0.8694444444444445 | 0 |
| 0.8701388888888889 | 0 |
| 0.8708333333333332 | 0 |
| 0.8715277777777778 | 0 |
| 0.8722222222222222 | 0 |
| 0.8729166666666667 | 0 |
| 0.873611111111111 | 0 |
| 0.8743055555555556 | 0 |
| 0.875 | 0 |
| 0.8756944444444444 | 0 |
| 0.876388888888889 | 0 |
| 0.8770833333333333 | 0 |
| 0.8777777777777778 | 0 |
| 0.8784722222222222 | 0 |
| 0.8791666666666668 | 0 |
| 0.8798611111111111 | 0 |
| 0.8805555555555555 | 0 |
| 0.88125 | 0 |
| 0.8819444444444445 | 0 |
| 0.8826388888888889 | 0 |
| 0.8833333333333333 | 0 |
| 0.8840277777777777 | 0 |
| 0.8847222222222223 | 0 |
| 0.8854166666666666 | 0 |
| 0.8861111111111111 | 0 |
| 0.8868055555555556 | 0 |
| 0.8875000000000001 | 0 |
| 0.8881944444444444 | 0 |
| 0.8888888888888888 | 0 |
| 0.8895833333333334 | 0 |
| 0.8902777777777778 | 0 |
| 0.8909722222222222 | 0 |
| 0.8916666666666666 | 0 |
| 0.8923611111111112 | 0 |
| 0.8930555555555556 | 0 |
| 0.8937499999999999 | 0 |
| 0.8944444444444444 | 0 |
| 0.8951388888888889 | 0 |
| 0.8958333333333334 | 0 |
| 0.8965277777777777 | 0 |
| 0.8972222222222223 | 0 |
| 0.8979166666666667 | 0 |
| 0.8986111111111111 | 0 |
| 0.8993055555555555 | 0 |
| 0.9 | 0 |
| 0.9006944444444445 | 0 |
| 0.9013888888888889 | 0 |
| 0.9020833333333332 | 0 |
| 0.9027777777777778 | 0 |
| 0.9034722222222222 | 0 |
| 0.9041666666666667 | 0 |
| 0.904861111111111 | 0 |
| 0.9055555555555556 | 0 |
| 0.90625 | 0 |
| 0.9069444444444444 | 0 |
| 0.907638888888889 | 0 |
| 0.9083333333333333 | 0 |
| 0.9090277777777778 | 0 |
| 0.9097222222222222 | 0 |
| 0.9104166666666668 | 0 |
| 0.9111111111111111 | 0 |
| 0.9118055555555555 | 0 |
| 0.9125 | 0 |
| 0.9131944444444445 | 0 |
| 0.9138888888888889 | 0 |
| 0.9145833333333333 | 0 |
| 0.9152777777777777 | 0 |
| 0.9159722222222223 | 0 |
| 0.9166666666666666 | 0 |
| 0.9173611111111111 | 0 |
| 0.9180555555555556 | 0 |
| 0.9187500000000001 | 0 |
| 0.9194444444444444 | 0 |
| 0.9201388888888888 | 0 |
| 0.9208333333333334 | 0 |
| 0.9215277777777778 | 0 |
| 0.9222222222222222 | 0 |
| 0.9229166666666666 | 0 |
| 0.9236111111111112 | 0 |
| 0.9243055555555556 | 0 |
| 0.9249999999999999 | 0 |
| 0.9256944444444444 | 0 |
| 0.9263888888888889 | 0 |
| 0.9270833333333334 | 0 |
| 0.9277777777777777 | 0 |
| 0.9284722222222223 | 0 |
| 0.9291666666666667 | 0 |
| 0.9298611111111111 | 0 |
| 0.9305555555555555 | 0 |
| 0.93125 | 0 |
| 0.9319444444444445 | 0 |
| 0.9326388888888889 | 0 |
| 0.9333333333333332 | 0 |
| 0.9340277777777778 | 0 |
| 0.9347222222222222 | 0 |
| 0.9354166666666667 | 0 |
| 0.936111111111111 | 0 |
| 0.9368055555555556 | 0 |
| 0.9375 | 0 |
| 0.9381944444444444 | 0 |
| 0.938888888888889 | 0 |
| 0.9395833333333333 | 0 |
| 0.9402777777777778 | 0 |
| 0.9409722222222222 | 0 |
| 0.9416666666666668 | 0 |
| 0.9423611111111111 | 0 |
| 0.9430555555555555 | 0 |
| 0.94375 | 0 |
| 0.9444444444444445 | 0 |
| 0.9451388888888889 | 0 |
| 0.9458333333333333 | 0 |
| 0.9465277777777777 | 0 |
| 0.9472222222222223 | 0 |
| 0.9479166666666666 | 0 |
| 0.9486111111111111 | 0 |
| 0.9493055555555556 | 0 |
| 0.9500000000000001 | 0 |
| 0.9506944444444444 | 0 |
| 0.9513888888888888 | 0 |
| 0.9520833333333334 | 0 |
| 0.9527777777777778 | 0 |
| 0.9534722222222222 | 0 |
| 0.9541666666666666 | 0 |
| 0.9548611111111112 | 0 |
| 0.9555555555555556 | 0 |
| 0.9562499999999999 | 0 |
| 0.9569444444444444 | 0 |
| 0.9576388888888889 | 0 |
| 0.9583333333333334 | 0 |
| 0.9590277777777777 | 0 |
| 0.9597222222222223 | 0 |
| 0.9604166666666667 | 0 |
| 0.9611111111111111 | 0 |
| 0.9618055555555555 | 0 |
| 0.9625 | 0 |
| 0.9631944444444445 | 0 |
| 0.9638888888888889 | 0 |
| 0.9645833333333332 | 0 |
| 0.9652777777777778 | 0 |
| 0.9659722222222222 | 0 |
| 0.9666666666666667 | 0 |
| 0.967361111111111 | 0 |
| 0.9680555555555556 | 0 |
| 0.96875 | 0 |
| 0.9694444444444444 | 0 |
| 0.970138888888889 | 0 |
| 0.9708333333333333 | 0 |
| 0.9715277777777778 | 0 |
| 0.9722222222222222 | 0 |
| 0.9729166666666668 | 0 |
| 0.9736111111111111 | 0 |
| 0.9743055555555555 | 0 |
| 0.975 | 0 |
| 0.9756944444444445 | 0 |
| 0.9763888888888889 | 0 |
| 0.9770833333333333 | 0 |
| 0.9777777777777777 | 0 |
| 0.9784722222222223 | 0 |
| 0.9791666666666666 | 0 |
| 0.9798611111111111 | 0 |
| 0.9805555555555556 | 0 |
| 0.9812500000000001 | 0 |
| 0.9819444444444444 | 0 |
| 0.9826388888888888 | 0 |
| 0.9833333333333334 | 0 |
| 0.9840277777777778 | 0 |
| 0.9847222222222222 | 0 |
| 0.9854166666666666 | 0 |
| 0.9861111111111112 | 0 |
| 0.9868055555555556 | 0 |
| 0.9874999999999999 | 0 |
| 0.9881944444444444 | 0 |
| 0.9888888888888889 | 0 |
| 0.9895833333333334 | 0 |
| 0.9902777777777777 | 0 |
| 0.9909722222222223 | 0 |
| 0.9916666666666667 | 0 |
| 0.9923611111111111 | 0 |
| 0.9930555555555555 | 0 |
| 0.99375 | 0 |
| 0.9944444444444445 | 0 |
| 0.9951388888888889 | 0 |
| 0.9958333333333332 | 0 |
| 0.9965277777777778 | 0 |
| 0.9972222222222222 | 0 |
| 0.9979166666666667 | 0 |
| 0.998611111111111 | 0 |
| 0.9993055555555556 | 0 |